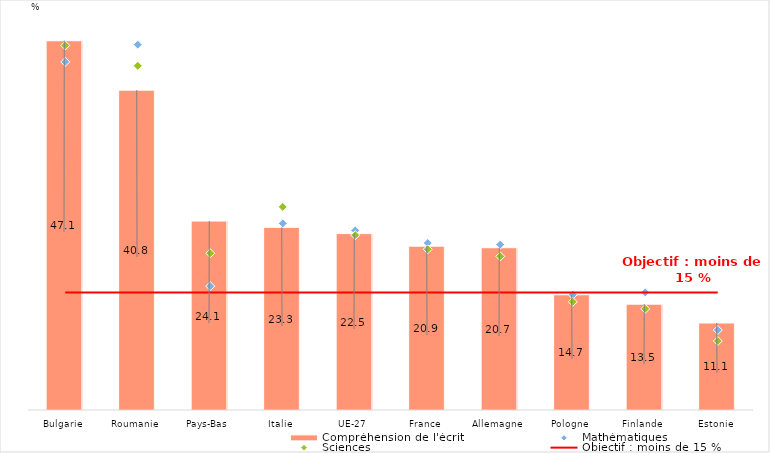
| Category | Compréhension de l'écrit |
|---|---|
| Bulgarie | 47.1 |
| Roumanie | 40.8 |
| Pays-Bas | 24.1 |
| Italie | 23.3 |
| UE-27 | 22.5 |
| France | 20.9 |
| Allemagne | 20.7 |
| Pologne | 14.7 |
| Finlande | 13.5 |
| Estonie | 11.1 |